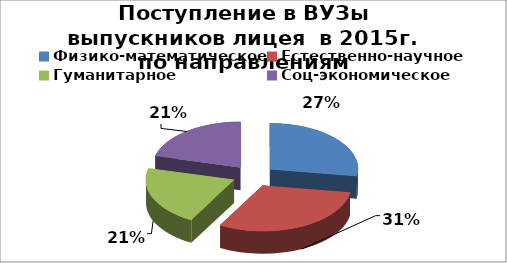
| Category | Series 0 |
|---|---|
| Физико-математическое | 17 |
| Естественно-научное | 19 |
| Гуманитарное | 13 |
| Соц-экономическое | 13 |